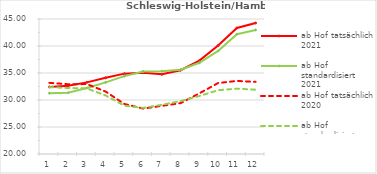
| Category | ab Hof tatsächlich 2021 | ab Hof standardisiert 2021 | ab Hof tatsächlich 2020 | ab Hof standardisiert 2020 |
|---|---|---|---|---|
| 0 | 32.418 | 31.262 | 33.176 | 32.369 |
| 1 | 32.648 | 31.35 | 32.923 | 32.226 |
| 2 | 33.266 | 32.225 | 32.945 | 32.141 |
| 3 | 34.116 | 33.264 | 31.561 | 30.84 |
| 4 | 34.884 | 34.422 | 29.264 | 28.951 |
| 5 | 35.044 | 35.284 | 28.411 | 28.541 |
| 6 | 34.751 | 35.346 | 28.916 | 29.107 |
| 7 | 35.511 | 35.596 | 29.417 | 29.795 |
| 8 | 37.286 | 36.896 | 31.236 | 30.738 |
| 9 | 40.079 | 39.08 | 33.143 | 31.812 |
| 10 | 43.339 | 42.194 | 33.533 | 32.102 |
| 11 | 44.26 | 42.975 | 33.359 | 31.911 |